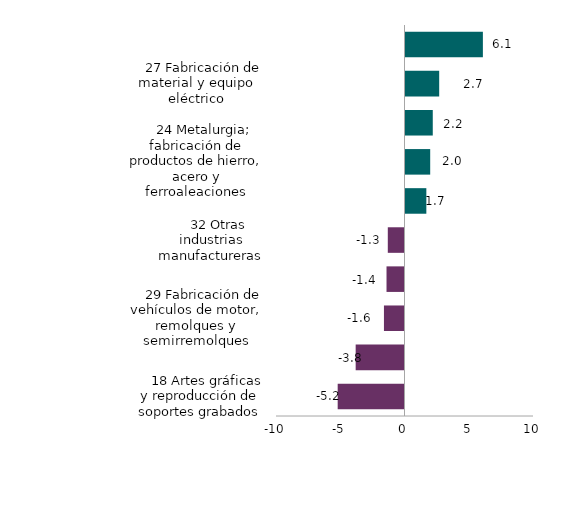
| Category | Series 0 |
|---|---|
|     18 Artes gráficas y reproducción de soportes grabados | -5.2 |
|     23 Fabricación de otros productos minerales no metálicos | -3.8 |
|     29 Fabricación de vehículos de motor, remolques y semirremolques | -1.6 |
|     20 Industria química | -1.4 |
|     32 Otras industrias manufactureras | -1.3 |
|     36 Captación, depuración y distribución de agua | 1.7 |
|     24 Metalurgia; fabricación de productos de hierro, acero y ferroaleaciones | 2 |
|     35 Suministro de energía eléctrica, gas, vapor y aire acondicionado | 2.2 |
|     27 Fabricación de material y equipo eléctrico | 2.7 |
|     17 Industria del papel | 6.1 |